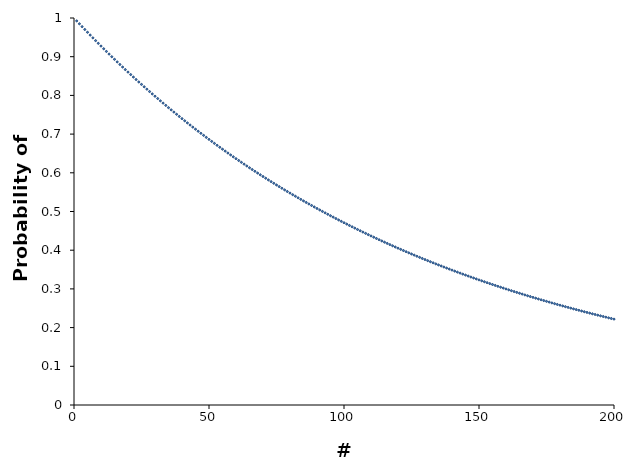
| Category | Series 0 |
|---|---|
| 1.0 | 0.992 |
| 2.0 | 0.985 |
| 3.0 | 0.978 |
| 4.0 | 0.97 |
| 5.0 | 0.963 |
| 6.0 | 0.956 |
| 7.0 | 0.949 |
| 8.0 | 0.942 |
| 9.0 | 0.934 |
| 10.0 | 0.927 |
| 11.0 | 0.921 |
| 12.0 | 0.914 |
| 13.0 | 0.907 |
| 14.0 | 0.9 |
| 15.0 | 0.893 |
| 16.0 | 0.887 |
| 17.0 | 0.88 |
| 18.0 | 0.873 |
| 19.0 | 0.867 |
| 20.0 | 0.86 |
| 21.0 | 0.854 |
| 22.0 | 0.847 |
| 23.0 | 0.841 |
| 24.0 | 0.835 |
| 25.0 | 0.828 |
| 26.0 | 0.822 |
| 27.0 | 0.816 |
| 28.0 | 0.81 |
| 29.0 | 0.804 |
| 30.0 | 0.798 |
| 31.0 | 0.792 |
| 32.0 | 0.786 |
| 33.0 | 0.78 |
| 34.0 | 0.774 |
| 35.0 | 0.768 |
| 36.0 | 0.763 |
| 37.0 | 0.757 |
| 38.0 | 0.751 |
| 39.0 | 0.746 |
| 40.0 | 0.74 |
| 41.0 | 0.734 |
| 42.0 | 0.729 |
| 43.0 | 0.723 |
| 44.0 | 0.718 |
| 45.0 | 0.713 |
| 46.0 | 0.707 |
| 47.0 | 0.702 |
| 48.0 | 0.697 |
| 49.0 | 0.692 |
| 50.0 | 0.686 |
| 51.0 | 0.681 |
| 52.0 | 0.676 |
| 53.0 | 0.671 |
| 54.0 | 0.666 |
| 55.0 | 0.661 |
| 56.0 | 0.656 |
| 57.0 | 0.651 |
| 58.0 | 0.646 |
| 59.0 | 0.641 |
| 60.0 | 0.637 |
| 61.0 | 0.632 |
| 62.0 | 0.627 |
| 63.0 | 0.622 |
| 64.0 | 0.618 |
| 65.0 | 0.613 |
| 66.0 | 0.608 |
| 67.0 | 0.604 |
| 68.0 | 0.599 |
| 69.0 | 0.595 |
| 70.0 | 0.59 |
| 71.0 | 0.586 |
| 72.0 | 0.582 |
| 73.0 | 0.577 |
| 74.0 | 0.573 |
| 75.0 | 0.569 |
| 76.0 | 0.564 |
| 77.0 | 0.56 |
| 78.0 | 0.556 |
| 79.0 | 0.552 |
| 80.0 | 0.548 |
| 81.0 | 0.543 |
| 82.0 | 0.539 |
| 83.0 | 0.535 |
| 84.0 | 0.531 |
| 85.0 | 0.527 |
| 86.0 | 0.523 |
| 87.0 | 0.519 |
| 88.0 | 0.516 |
| 89.0 | 0.512 |
| 90.0 | 0.508 |
| 91.0 | 0.504 |
| 92.0 | 0.5 |
| 93.0 | 0.497 |
| 94.0 | 0.493 |
| 95.0 | 0.489 |
| 96.0 | 0.485 |
| 97.0 | 0.482 |
| 98.0 | 0.478 |
| 99.0 | 0.475 |
| 100.0 | 0.471 |
| 101.0 | 0.468 |
| 102.0 | 0.464 |
| 103.0 | 0.461 |
| 104.0 | 0.457 |
| 105.0 | 0.454 |
| 106.0 | 0.45 |
| 107.0 | 0.447 |
| 108.0 | 0.444 |
| 109.0 | 0.44 |
| 110.0 | 0.437 |
| 111.0 | 0.434 |
| 112.0 | 0.43 |
| 113.0 | 0.427 |
| 114.0 | 0.424 |
| 115.0 | 0.421 |
| 116.0 | 0.418 |
| 117.0 | 0.414 |
| 118.0 | 0.411 |
| 119.0 | 0.408 |
| 120.0 | 0.405 |
| 121.0 | 0.402 |
| 122.0 | 0.399 |
| 123.0 | 0.396 |
| 124.0 | 0.393 |
| 125.0 | 0.39 |
| 126.0 | 0.387 |
| 127.0 | 0.384 |
| 128.0 | 0.382 |
| 129.0 | 0.379 |
| 130.0 | 0.376 |
| 131.0 | 0.373 |
| 132.0 | 0.37 |
| 133.0 | 0.367 |
| 134.0 | 0.365 |
| 135.0 | 0.362 |
| 136.0 | 0.359 |
| 137.0 | 0.357 |
| 138.0 | 0.354 |
| 139.0 | 0.351 |
| 140.0 | 0.349 |
| 141.0 | 0.346 |
| 142.0 | 0.343 |
| 143.0 | 0.341 |
| 144.0 | 0.338 |
| 145.0 | 0.336 |
| 146.0 | 0.333 |
| 147.0 | 0.331 |
| 148.0 | 0.328 |
| 149.0 | 0.326 |
| 150.0 | 0.323 |
| 151.0 | 0.321 |
| 152.0 | 0.318 |
| 153.0 | 0.316 |
| 154.0 | 0.314 |
| 155.0 | 0.311 |
| 156.0 | 0.309 |
| 157.0 | 0.307 |
| 158.0 | 0.304 |
| 159.0 | 0.302 |
| 160.0 | 0.3 |
| 161.0 | 0.298 |
| 162.0 | 0.295 |
| 163.0 | 0.293 |
| 164.0 | 0.291 |
| 165.0 | 0.289 |
| 166.0 | 0.287 |
| 167.0 | 0.284 |
| 168.0 | 0.282 |
| 169.0 | 0.28 |
| 170.0 | 0.278 |
| 171.0 | 0.276 |
| 172.0 | 0.274 |
| 173.0 | 0.272 |
| 174.0 | 0.27 |
| 175.0 | 0.268 |
| 176.0 | 0.266 |
| 177.0 | 0.264 |
| 178.0 | 0.262 |
| 179.0 | 0.26 |
| 180.0 | 0.258 |
| 181.0 | 0.256 |
| 182.0 | 0.254 |
| 183.0 | 0.252 |
| 184.0 | 0.25 |
| 185.0 | 0.248 |
| 186.0 | 0.247 |
| 187.0 | 0.245 |
| 188.0 | 0.243 |
| 189.0 | 0.241 |
| 190.0 | 0.239 |
| 191.0 | 0.237 |
| 192.0 | 0.236 |
| 193.0 | 0.234 |
| 194.0 | 0.232 |
| 195.0 | 0.23 |
| 196.0 | 0.229 |
| 197.0 | 0.227 |
| 198.0 | 0.225 |
| 199.0 | 0.224 |
| 200.0 | 0.222 |